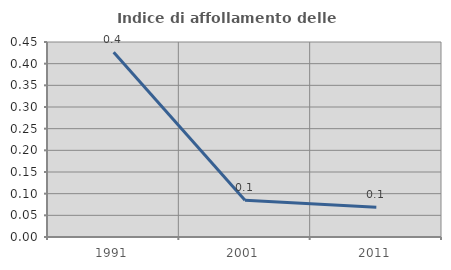
| Category | Indice di affollamento delle abitazioni  |
|---|---|
| 1991.0 | 0.426 |
| 2001.0 | 0.085 |
| 2011.0 | 0.068 |